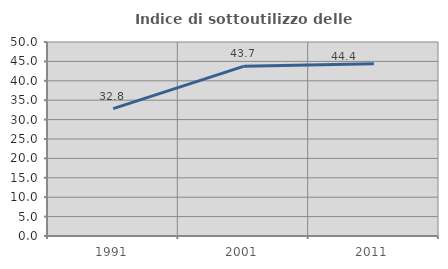
| Category | Indice di sottoutilizzo delle abitazioni  |
|---|---|
| 1991.0 | 32.836 |
| 2001.0 | 43.724 |
| 2011.0 | 44.401 |